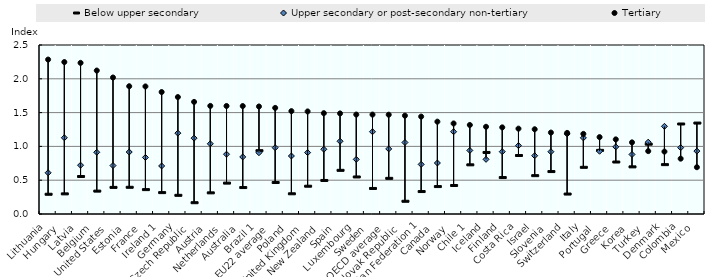
| Category | Below upper secondary | Upper secondary or post-secondary non-tertiary | Tertiary |
|---|---|---|---|
| Lithuania  | 0.292 | 0.61 | 2.285 |
| Hungary  | 0.298 | 1.128 | 2.248 |
| Latvia  | 0.555 | 0.722 | 2.236 |
| Belgium  | 0.339 | 0.913 | 2.122 |
| United States  | 0.393 | 0.717 | 2.019 |
| Estonia  | 0.395 | 0.917 | 1.89 |
| France  | 0.361 | 0.837 | 1.887 |
| Ireland 1 | 0.316 | 0.711 | 1.804 |
| Germany  | 0.276 | 1.196 | 1.73 |
| Czech Republic  | 0.167 | 1.122 | 1.658 |
| Austria  | 0.313 | 1.039 | 1.599 |
| Netherlands  | 0.457 | 0.884 | 1.598 |
| Australia  | 0.391 | 0.844 | 1.597 |
| Brazil 1 | 0.937 | 0.906 | 1.591 |
| EU22 average  | 0.466 | 0.981 | 1.57 |
| Poland  | 0.299 | 0.858 | 1.522 |
| United Kingdom  | 0.411 | 0.908 | 1.517 |
| New Zealand  | 0.496 | 0.957 | 1.492 |
| Spain  | 0.646 | 1.076 | 1.488 |
| Luxembourg  | 0.548 | 0.808 | 1.471 |
| Sweden  | 0.378 | 1.217 | 1.471 |
| OECD average  | 0.527 | 0.963 | 1.469 |
| Slovak Republic  | 0.188 | 1.058 | 1.455 |
| Russian Federation 1 | 0.332 | 0.734 | 1.441 |
| Canada  | 0.406 | 0.754 | 1.366 |
| Norway  | 0.422 | 1.217 | 1.339 |
| Chile 1 | 0.727 | 0.94 | 1.317 |
| Iceland  | 0.91 | 0.809 | 1.29 |
| Finland  | 0.539 | 0.922 | 1.282 |
| Costa Rica  | 0.865 | 1.012 | 1.263 |
| Israel  | 0.567 | 0.863 | 1.254 |
| Slovenia  | 0.628 | 0.922 | 1.205 |
| Switzerland  | 0.295 | 1.185 | 1.2 |
| Italy  | 0.69 | 1.126 | 1.185 |
| Portugal  | 0.941 | 0.928 | 1.138 |
| Greece  | 0.769 | 0.993 | 1.104 |
| Korea  | 0.697 | 0.881 | 1.06 |
| Turkey  | 1.033 | 1.063 | 0.93 |
| Denmark  | 0.73 | 1.297 | 0.923 |
| Colombia  | 1.332 | 0.982 | 0.819 |
| Mexico  | 1.345 | 0.931 | 0.692 |